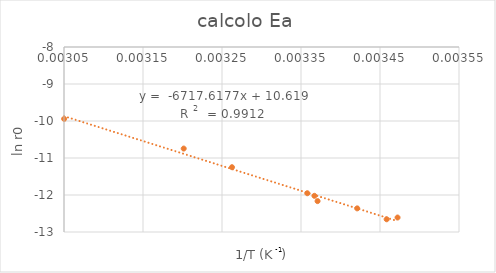
| Category | calcolo Ea |
|---|---|
| 0.003472222222222222 | -12.609 |
| 0.003458412588621823 | -12.656 |
| 0.003421142661648991 | -12.361 |
| 0.003370975897522333 | -12.165 |
| 0.003367003367003367 | -12.022 |
| 0.00335795836131632 | -11.952 |
| 0.0032626427406199023 | -11.249 |
| 0.0032015367376340646 | -10.745 |
| 0.0030501753850846426 | -9.943 |